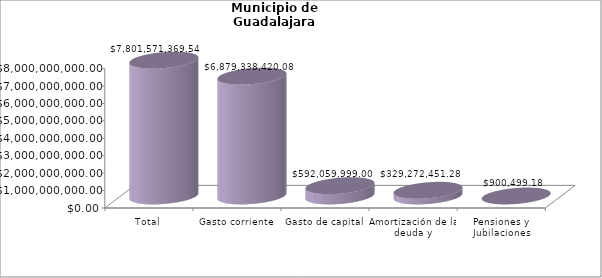
| Category | Municipio de Guadalajara
Tipo de Gasto de los ejercicios fiscales 2017-2022 |
|---|---|
| Total | 7801571369.54 |
| Gasto corriente | 6879338420.08 |
| Gasto de capital | 592059999 |
| Amortización de la deuda y disminución de pasivos | 329272451.28 |
| Pensiones y Jubilaciones | 900499.18 |